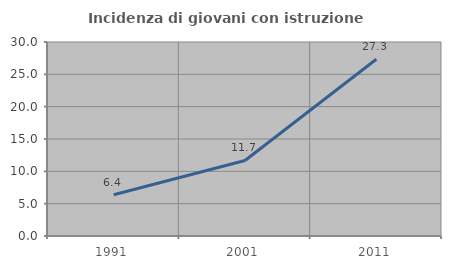
| Category | Incidenza di giovani con istruzione universitaria |
|---|---|
| 1991.0 | 6.373 |
| 2001.0 | 11.682 |
| 2011.0 | 27.334 |